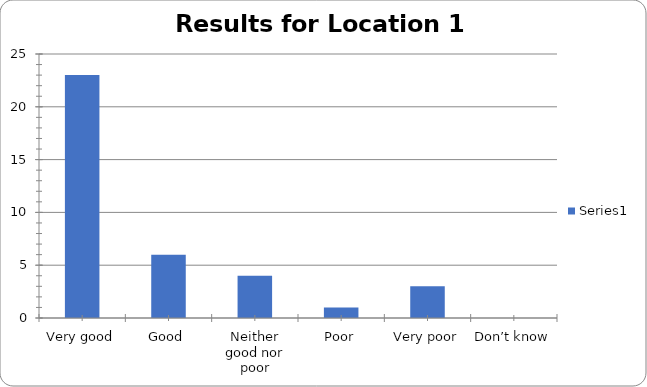
| Category | Series 0 |
|---|---|
| Very good | 23 |
| Good | 6 |
| Neither good nor poor | 4 |
| Poor | 1 |
| Very poor | 3 |
| Don’t know | 0 |